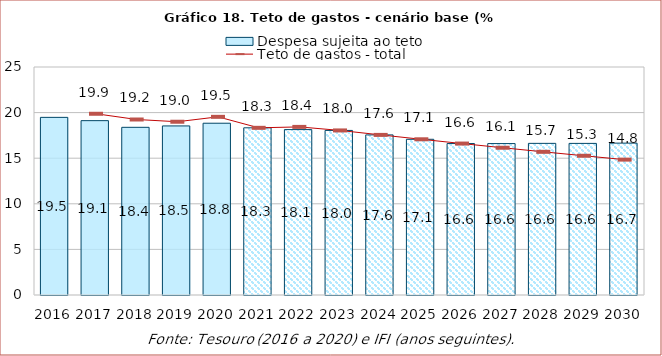
| Category | Despesa sujeita ao teto |
|---|---|
| 2016.0 | 19.478 |
| 2017.0 | 19.117 |
| 2018.0 | 18.386 |
| 2019.0 | 18.539 |
| 2020.0 | 18.835 |
| 2021.0 | 18.33 |
| 2022.0 | 18.135 |
| 2023.0 | 18.045 |
| 2024.0 | 17.555 |
| 2025.0 | 17.074 |
| 2026.0 | 16.605 |
| 2027.0 | 16.603 |
| 2028.0 | 16.627 |
| 2029.0 | 16.624 |
| 2030.0 | 16.652 |